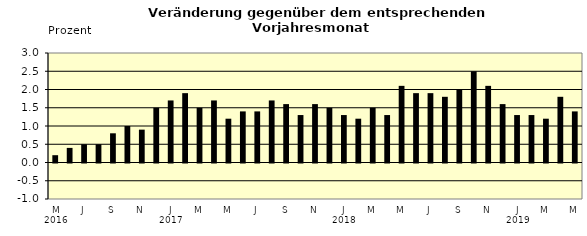
| Category | Series 0 |
|---|---|
| 0 | 0.2 |
| 1 | 0.4 |
| 2 | 0.5 |
| 3 | 0.5 |
| 4 | 0.8 |
| 5 | 1 |
| 6 | 0.9 |
| 7 | 1.5 |
| 8 | 1.7 |
| 9 | 1.9 |
| 10 | 1.5 |
| 11 | 1.7 |
| 12 | 1.2 |
| 13 | 1.4 |
| 14 | 1.4 |
| 15 | 1.7 |
| 16 | 1.6 |
| 17 | 1.3 |
| 18 | 1.6 |
| 19 | 1.5 |
| 20 | 1.3 |
| 21 | 1.2 |
| 22 | 1.5 |
| 23 | 1.3 |
| 24 | 2.1 |
| 25 | 1.9 |
| 26 | 1.9 |
| 27 | 1.8 |
| 28 | 2 |
| 29 | 2.5 |
| 30 | 2.1 |
| 31 | 1.6 |
| 32 | 1.3 |
| 33 | 1.3 |
| 34 | 1.2 |
| 35 | 1.8 |
| 36 | 1.4 |